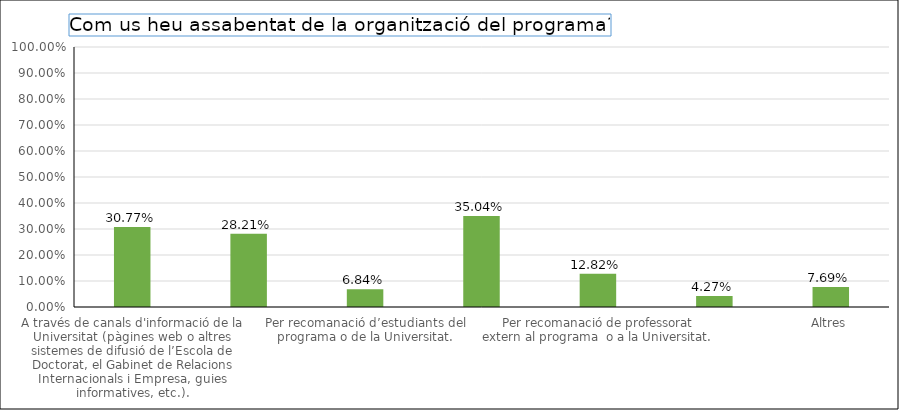
| Category | Series 0 |
|---|---|
| A través de canals d'informació de la Universitat (pàgines web o altres sistemes de difusió de l’Escola de Doctorat, el Gabinet de Relacions Internacionals i Empresa, guies informatives, etc.). | 0.308 |
| A través del departament o de l'institut (pàgines web pròpies i altres sistemes de difusió). | 0.282 |
| Per recomanació d’estudiants del programa o de la Universitat. | 0.068 |
| Per recomanació de professorat del programa o de la Universitat. | 0.35 |
| Per recomanació de professorat extern al programa  o a la Universitat. | 0.128 |
| Webs especialitzats. | 0.043 |
| Altres | 0.077 |